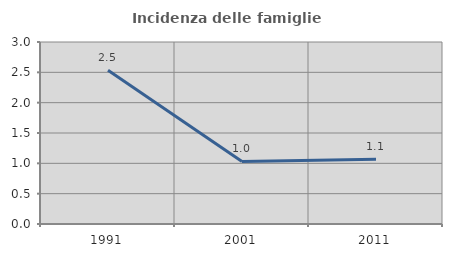
| Category | Incidenza delle famiglie numerose |
|---|---|
| 1991.0 | 2.536 |
| 2001.0 | 1.031 |
| 2011.0 | 1.067 |